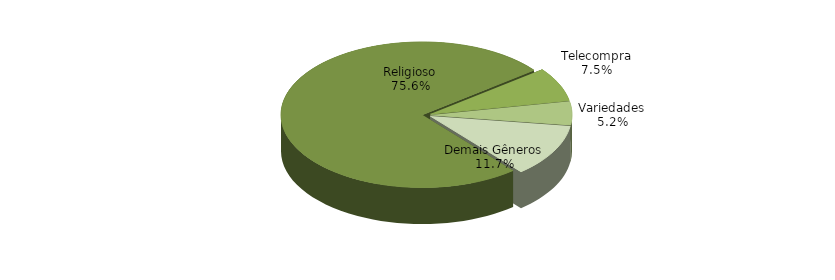
| Category | Series 0 |
|---|---|
| Religioso | 0.756 |
| Telecompra | 0.075 |
| Variedades | 0.052 |
| Demais Gêneros | 0.117 |